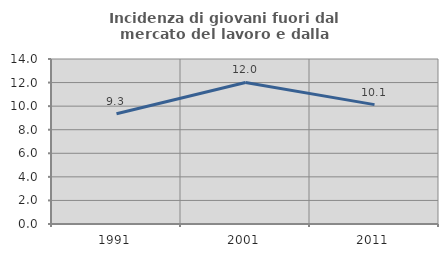
| Category | Incidenza di giovani fuori dal mercato del lavoro e dalla formazione  |
|---|---|
| 1991.0 | 9.348 |
| 2001.0 | 12.008 |
| 2011.0 | 10.131 |